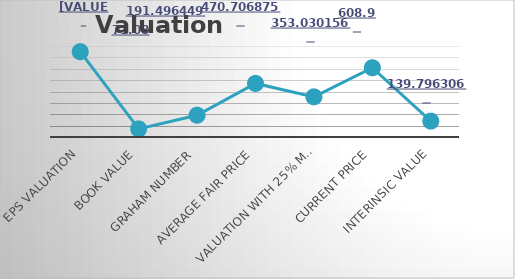
| Category | Series 0 |
|---|---|
| EPS Valuation | 749.917 |
| Book value | 71.08 |
| Graham Number | 191.496 |
| Average Fair Price | 470.707 |
| Valuation with 25% Margin of safety  | 353.03 |
| Current Price | 608.95 |
| Interinsic Value | 139.796 |